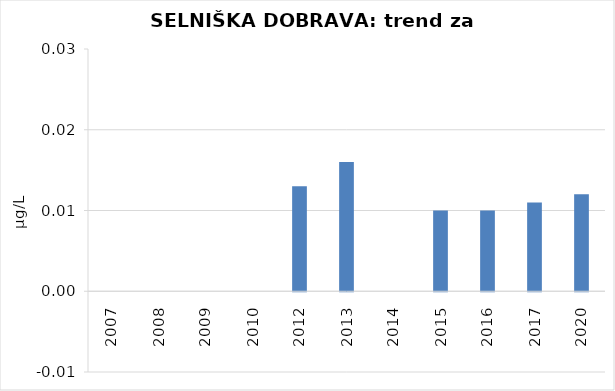
| Category | Vsota |
|---|---|
| 2007 | 0 |
| 2008 | 0 |
| 2009 | 0 |
| 2010 | 0 |
| 2012 | 0.013 |
| 2013 | 0.016 |
| 2014 | 0 |
| 2015 | 0.01 |
| 2016 | 0.01 |
| 2017 | 0.011 |
| 2020 | 0.012 |